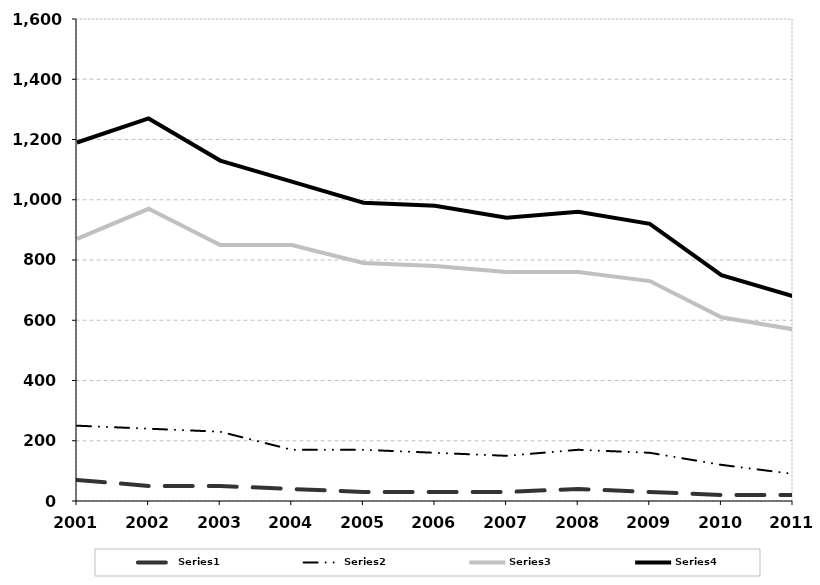
| Category | Series 0 | Series 1 | Series 2 | Series 3 |
|---|---|---|---|---|
| 2001.0 | 70 | 250 | 870 | 1190 |
| 2002.0 | 50 | 240 | 970 | 1270 |
| 2003.0 | 50 | 230 | 850 | 1130 |
| 2004.0 | 40 | 170 | 850 | 1060 |
| 2005.0 | 30 | 170 | 790 | 990 |
| 2006.0 | 30 | 160 | 780 | 980 |
| 2007.0 | 30 | 150 | 760 | 940 |
| 2008.0 | 40 | 170 | 760 | 960 |
| 2009.0 | 30 | 160 | 730 | 920 |
| 2010.0 | 20 | 120 | 610 | 750 |
| 2011.0 | 20 | 90 | 570 | 680 |